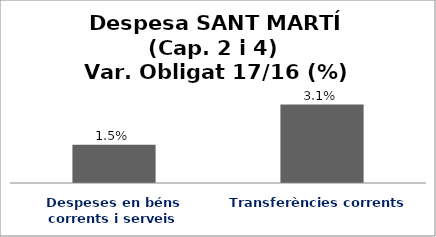
| Category | Series 0 |
|---|---|
| Despeses en béns corrents i serveis | 0.015 |
| Transferències corrents | 0.031 |